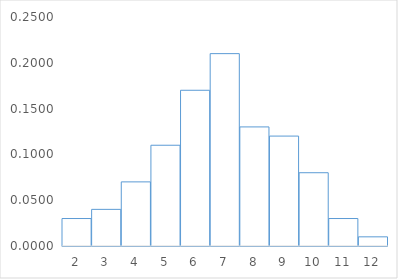
| Category | Series 0 |
|---|---|
| 2.0 | 0.03 |
| 3.0 | 0.04 |
| 4.0 | 0.07 |
| 5.0 | 0.11 |
| 6.0 | 0.17 |
| 7.0 | 0.21 |
| 8.0 | 0.13 |
| 9.0 | 0.12 |
| 10.0 | 0.08 |
| 11.0 | 0.03 |
| 12.0 | 0.01 |